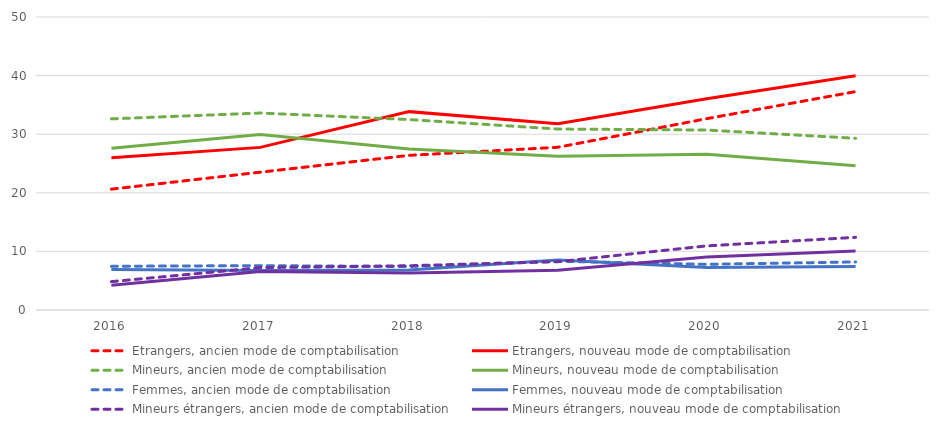
| Category | Etrangers, ancien mode de comptabilisation | Etrangers, nouveau mode de comptabilisation | Mineurs, ancien mode de comptabilisation | Mineurs, nouveau mode de comptabilisation | Femmes, ancien mode de comptabilisation | Femmes, nouveau mode de comptabilisation | Mineurs étrangers, ancien mode de comptabilisation | Mineurs étrangers, nouveau mode de comptabilisation |
|---|---|---|---|---|---|---|---|---|
| 2016.0 | 20.62 | 26 | 32.62 | 27.62 | 7.46 | 6.91 | 4.84 | 4.22 |
| 2017.0 | 23.52 | 27.75 | 33.61 | 29.93 | 7.57 | 6.73 | 7.23 | 6.57 |
| 2018.0 | 26.39 | 33.85 | 32.5 | 27.46 | 7.42 | 6.81 | 7.55 | 6.3 |
| 2019.0 | 27.77 | 31.78 | 30.88 | 26.23 | 8.33 | 8.53 | 8.25 | 6.8 |
| 2020.0 | 32.65 | 36.06 | 30.71 | 26.58 | 7.8 | 7.25 | 10.94 | 9.05 |
| 2021.0 | 37.27 | 39.96 | 29.3 | 24.63 | 8.2 | 7.42 | 12.4 | 10.08 |